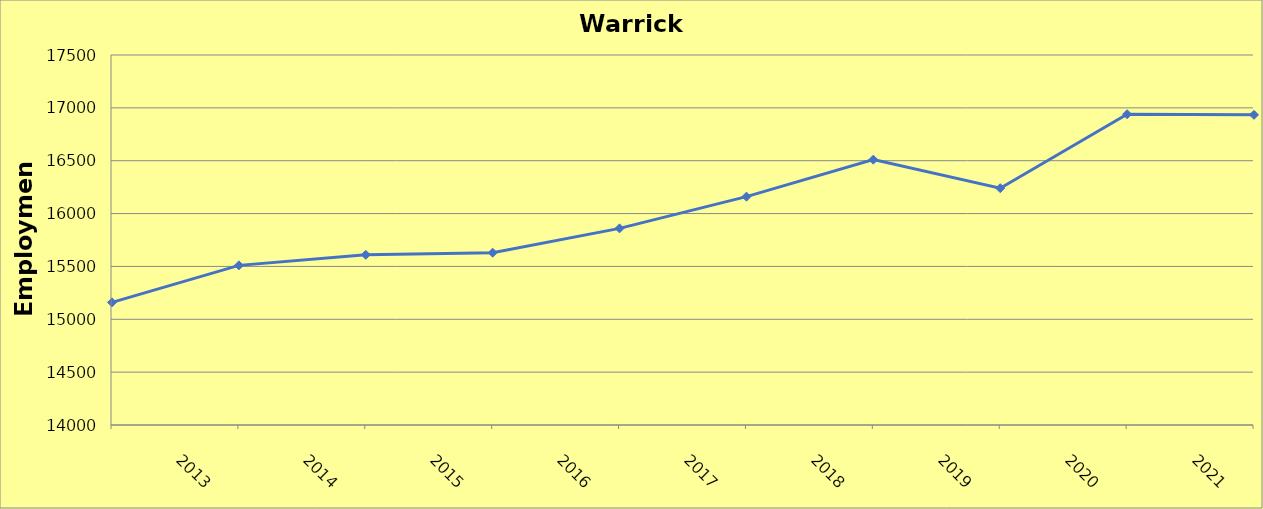
| Category | Warrick County |
|---|---|
| 2013.0 | 15160 |
| 2014.0 | 15510 |
| 2015.0 | 15610 |
| 2016.0 | 15630 |
| 2017.0 | 15860 |
| 2018.0 | 16160 |
| 2019.0 | 16510 |
| 2020.0 | 16240 |
| 2021.0 | 16940 |
| 2022.0 | 16934 |